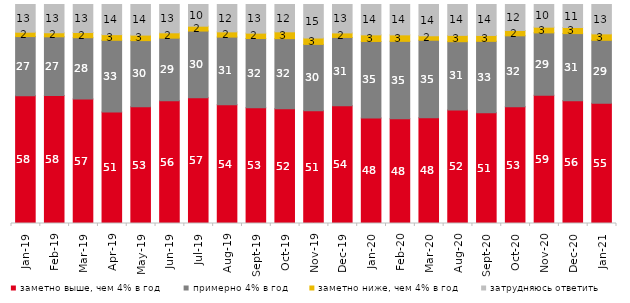
| Category | заметно выше, чем 4% в год | примерно 4% в год | заметно ниже, чем 4% в год | затрудняюсь ответить |
|---|---|---|---|---|
| 2019-01-01 | 58.3 | 27.05 | 2 | 12.65 |
| 2019-02-01 | 58.45 | 26.8 | 1.85 | 12.9 |
| 2019-03-01 | 56.887 | 27.946 | 2.387 | 12.78 |
| 2019-04-01 | 50.891 | 32.772 | 2.574 | 13.762 |
| 2019-05-01 | 53.343 | 30.163 | 2.526 | 13.967 |
| 2019-06-01 | 56.06 | 28.579 | 2.444 | 12.918 |
| 2019-07-01 | 57.475 | 30.396 | 2.228 | 9.901 |
| 2019-08-01 | 54.246 | 30.869 | 2.398 | 12.488 |
| 2019-09-01 | 52.822 | 31.634 | 2.475 | 13.069 |
| 2019-10-01 | 52.426 | 31.98 | 3.119 | 12.475 |
| 2019-11-01 | 51.485 | 30.297 | 2.921 | 15.297 |
| 2019-12-01 | 53.713 | 31.238 | 2.079 | 12.97 |
| 2020-01-01 | 48.119 | 35 | 3.02 | 13.861 |
| 2020-02-01 | 47.822 | 35.347 | 2.97 | 13.861 |
| 2020-03-01 | 48.24 | 35.449 | 2.033 | 14.279 |
| 2020-08-01 | 51.787 | 31.231 | 2.88 | 14.101 |
| 2020-09-01 | 50.523 | 32.653 | 2.688 | 14.136 |
| 2020-10-01 | 53.264 | 32.436 | 2.441 | 11.858 |
| 2020-11-01 | 58.55 | 28.5 | 2.6 | 10.35 |
| 2020-12-01 | 56.073 | 30.64 | 2.776 | 10.511 |
| 2021-01-01 | 54.893 | 28.763 | 2.931 | 13.413 |